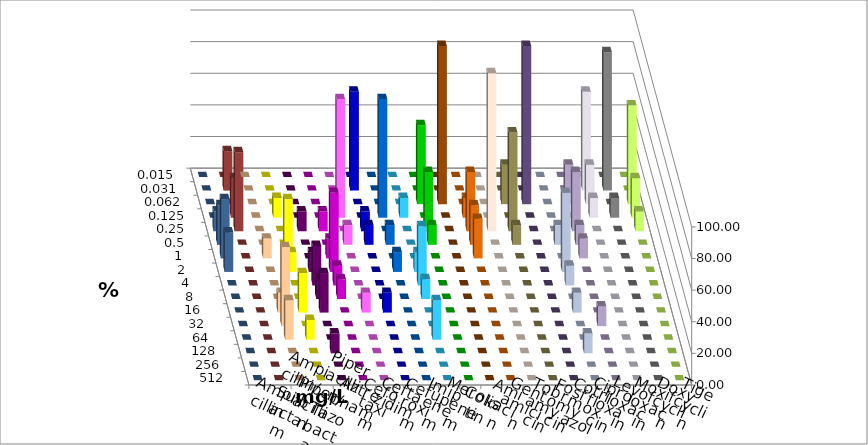
| Category | Ampicillin | Ampicillin/ Sulbactam | Piperacillin | Piperacillin/ Tazobactam | Aztreonam | Cefotaxim | Ceftazidim | Cefuroxim | Imipenem | Meropenem | Colistin | Amikacin | Gentamicin | Tobramycin | Fosfomycin | Cotrimoxazol | Ciprofloxacin | Levofloxacin | Moxifloxacin | Doxycyclin | Tigecyclin |
|---|---|---|---|---|---|---|---|---|---|---|---|---|---|---|---|---|---|---|---|---|---|
| 0.015 | 0 | 0 | 0 | 0 | 0 | 0 | 0 | 0 | 0 | 0 | 0 | 0 | 0 | 0 | 0 | 0 | 0 | 0 | 0 | 0 | 0 |
| 0.031 | 0 | 0 | 0 | 0 | 0 | 62.5 | 0 | 0 | 0 | 0 | 0 | 0 | 0 | 0 | 0 | 0 | 62.5 | 87.5 | 0 | 0 | 25 |
| 0.062 | 0 | 0 | 0 | 0 | 0 | 0 | 0 | 0 | 50 | 100 | 0 | 0 | 25 | 100 | 0 | 25 | 25 | 0 | 62.5 | 0 | 0 |
| 0.125 | 0 | 12.5 | 0 | 0 | 75 | 0 | 75 | 12.5 | 0 | 0 | 12.5 | 0 | 0 | 0 | 0 | 0 | 12.5 | 12.5 | 25 | 0 | 25 |
| 0.25 | 0 | 0 | 12.5 | 12.5 | 0 | 12.5 | 0 | 0 | 37.5 | 0 | 37.5 | 100 | 62.5 | 0 | 0 | 37.5 | 0 | 0 | 12.5 | 12.5 | 50 |
| 0.5 | 0 | 0 | 0 | 0 | 12.5 | 12.5 | 12.5 | 0 | 12.5 | 0 | 25 | 0 | 12.5 | 0 | 12.5 | 12.5 | 0 | 0 | 0 | 25 | 0 |
| 1.0 | 12.5 | 37.5 | 0 | 12.5 | 0 | 0 | 0 | 0 | 0 | 0 | 25 | 0 | 0 | 0 | 0 | 12.5 | 0 | 0 | 0 | 37.5 | 0 |
| 2.0 | 0 | 12.5 | 12.5 | 50 | 0 | 0 | 12.5 | 12.5 | 0 | 0 | 0 | 0 | 0 | 0 | 50 | 0 | 0 | 0 | 0 | 25 | 0 |
| 4.0 | 0 | 0 | 25 | 12.5 | 0 | 0 | 0 | 37.5 | 0 | 0 | 0 | 0 | 0 | 0 | 12.5 | 0 | 0 | 0 | 0 | 0 | 0 |
| 8.0 | 0 | 0 | 12.5 | 12.5 | 0 | 0 | 0 | 12.5 | 0 | 0 | 0 | 0 | 0 | 0 | 0 | 0 | 0 | 0 | 0 | 0 | 0 |
| 16.0 | 12.5 | 25 | 25 | 0 | 12.5 | 12.5 | 0 | 0 | 0 | 0 | 0 | 0 | 0 | 0 | 12.5 | 0 | 0 | 0 | 0 | 0 | 0 |
| 32.0 | 50 | 0 | 0 | 0 | 0 | 0 | 0 | 0 | 0 | 0 | 0 | 0 | 0 | 0 | 0 | 12.5 | 0 | 0 | 0 | 0 | 0 |
| 64.0 | 25 | 12.5 | 0 | 0 | 0 | 0 | 0 | 25 | 0 | 0 | 0 | 0 | 0 | 0 | 0 | 0 | 0 | 0 | 0 | 0 | 0 |
| 128.0 | 0 | 0 | 12.5 | 0 | 0 | 0 | 0 | 0 | 0 | 0 | 0 | 0 | 0 | 0 | 12.5 | 0 | 0 | 0 | 0 | 0 | 0 |
| 256.0 | 0 | 0 | 0 | 0 | 0 | 0 | 0 | 0 | 0 | 0 | 0 | 0 | 0 | 0 | 0 | 0 | 0 | 0 | 0 | 0 | 0 |
| 512.0 | 0 | 0 | 0 | 0 | 0 | 0 | 0 | 0 | 0 | 0 | 0 | 0 | 0 | 0 | 0 | 0 | 0 | 0 | 0 | 0 | 0 |